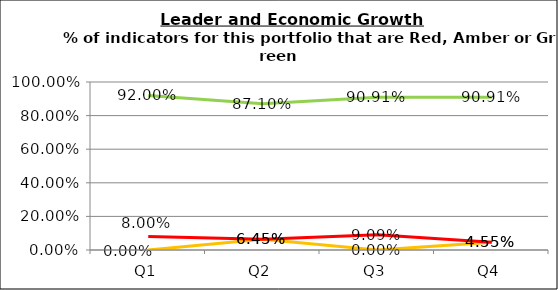
| Category | Green | Amber | Red |
|---|---|---|---|
| Q1 | 0.92 | 0 | 0.08 |
| Q2 | 0.871 | 0.065 | 0.065 |
| Q3 | 0.909 | 0 | 0.091 |
| Q4 | 0.909 | 0.045 | 0.045 |